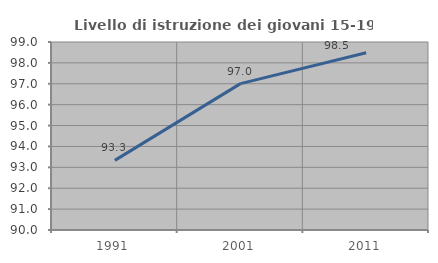
| Category | Livello di istruzione dei giovani 15-19 anni |
|---|---|
| 1991.0 | 93.333 |
| 2001.0 | 97.009 |
| 2011.0 | 98.489 |